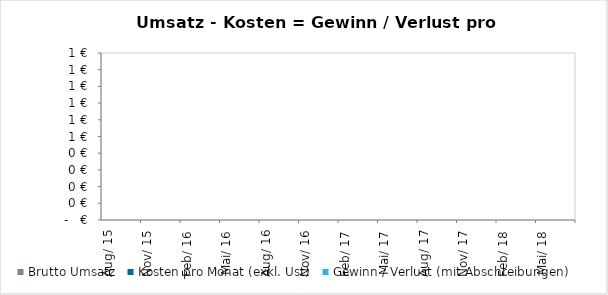
| Category | Brutto Umsatz | Kosten pro Monat (exkl. Ust) | Gewinn / Verlust (mit Abschreibungen) |
|---|---|---|---|
| 2015-08-01 | 0 | 0 | 0 |
| 2015-09-01 | 0 | 0 | 0 |
| 2015-10-01 | 0 | 0 | 0 |
| 2015-11-01 | 0 | 0 | 0 |
| 2015-12-01 | 0 | 0 | 0 |
| 2016-01-01 | 0 | 0 | 0 |
| 2016-02-01 | 0 | 0 | 0 |
| 2016-03-01 | 0 | 0 | 0 |
| 2016-04-01 | 0 | 0 | 0 |
| 2016-05-01 | 0 | 0 | 0 |
| 2016-06-01 | 0 | 0 | 0 |
| 2016-07-01 | 0 | 0 | 0 |
| 2016-08-01 | 0 | 0 | 0 |
| 2016-09-01 | 0 | 0 | 0 |
| 2016-10-01 | 0 | 0 | 0 |
| 2016-11-01 | 0 | 0 | 0 |
| 2016-12-01 | 0 | 0 | 0 |
| 2017-01-01 | 0 | 0 | 0 |
| 2017-02-01 | 0 | 0 | 0 |
| 2017-03-01 | 0 | 0 | 0 |
| 2017-04-01 | 0 | 0 | 0 |
| 2017-05-01 | 0 | 0 | 0 |
| 2017-06-01 | 0 | 0 | 0 |
| 2017-07-01 | 0 | 0 | 0 |
| 2017-08-01 | 0 | 0 | 0 |
| 2017-09-01 | 0 | 0 | 0 |
| 2017-10-01 | 0 | 0 | 0 |
| 2017-11-01 | 0 | 0 | 0 |
| 2017-12-01 | 0 | 0 | 0 |
| 2018-01-01 | 0 | 0 | 0 |
| 2018-02-01 | 0 | 0 | 0 |
| 2018-03-01 | 0 | 0 | 0 |
| 2018-04-01 | 0 | 0 | 0 |
| 2018-05-01 | 0 | 0 | 0 |
| 2018-06-01 | 0 | 0 | 0 |
| 2018-07-01 | 0 | 0 | 0 |